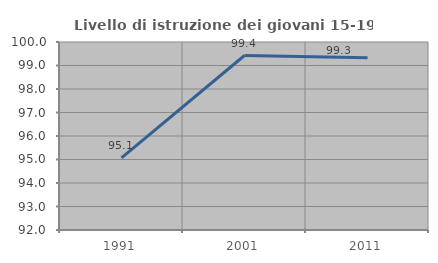
| Category | Livello di istruzione dei giovani 15-19 anni |
|---|---|
| 1991.0 | 95.067 |
| 2001.0 | 99.425 |
| 2011.0 | 99.329 |